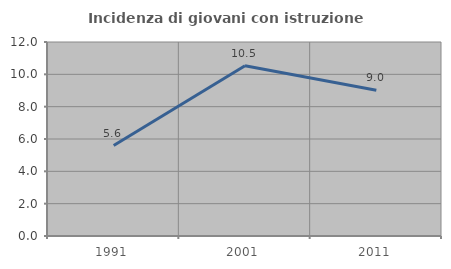
| Category | Incidenza di giovani con istruzione universitaria |
|---|---|
| 1991.0 | 5.594 |
| 2001.0 | 10.526 |
| 2011.0 | 9.016 |